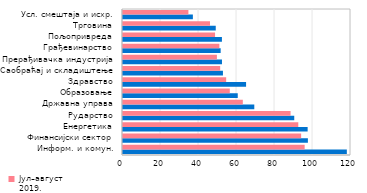
| Category | Јул–август 2020. | Јул–август 2019. |
|---|---|---|
| Информ. и комун. | 117.807 | 95.61 |
| Финансијски сектор | 97.308 | 93.763 |
| Енергетика | 97.178 | 92.262 |
| Рударство | 90.132 | 88.19 |
| Државна управа | 69.105 | 63.065 |
| Образовање | 60.394 | 56.206 |
| Здравство | 64.777 | 54.301 |
| Саобраћај и складиштење | 52.602 | 51.154 |
| Прерађивачка индустрија | 52.089 | 49.424 |
| Грађевинарство | 51.4 | 50.726 |
| Пољопривреда | 52.064 | 48.452 |
| Трговина | 48.812 | 45.793 |
| Усл. смештаја и исхр. | 36.774 | 34.429 |